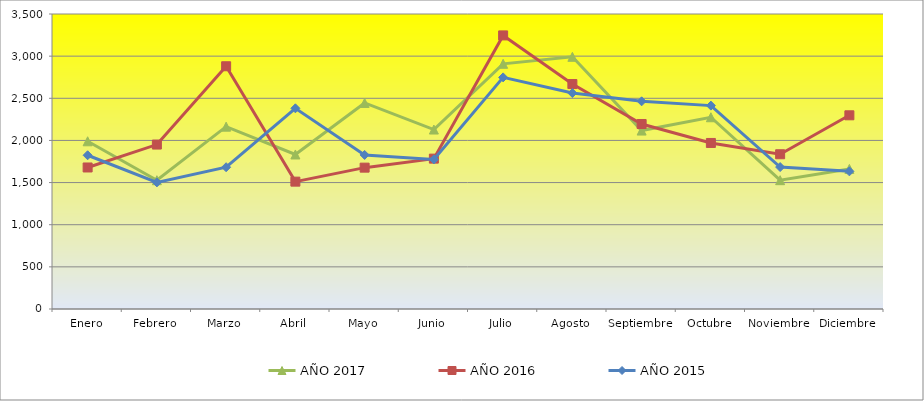
| Category | AÑO 2017 | AÑO 2016 | AÑO 2015 |
|---|---|---|---|
| Enero | 1989.778 | 1679 | 1824 |
| Febrero | 1527.778 | 1951 | 1502 |
| Marzo | 2163.333 | 2880 | 1682 |
| Abril | 1833.333 | 1511 | 2381 |
| Mayo | 2444.444 | 1677 | 1828 |
| Junio | 2129.111 | 1784 | 1775 |
| Julio | 2908.889 | 3246 | 2748 |
| Agosto | 2992 | 2669 | 2562 |
| Septiembre | 2116.889 | 2195 | 2464 |
| Octubre | 2274.894 | 1970 | 2413 |
| Noviembre | 1528.298 | 1836 | 1684 |
| Diciembre | 1662.222 | 2298 | 1633 |